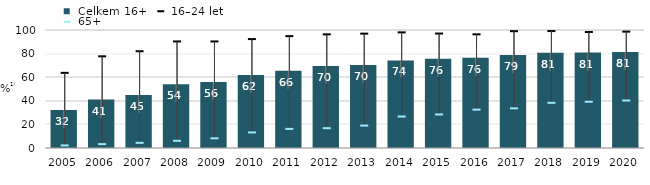
| Category |  Celkem 16+ |
|---|---|
| 2005.0 | 32.1 |
| 2006.0 | 41 |
| 2007.0 | 45 |
| 2008.0 | 54 |
| 2009.0 | 55.9 |
| 2010.0 | 61.8 |
| 2011.0 | 65.5 |
| 2012.0 | 69.5 |
| 2013.0 | 70.4 |
| 2014.0 | 74.232 |
| 2015.0 | 75.669 |
| 2016.0 | 76.481 |
| 2017.0 | 78.8 |
| 2018.0 | 80.7 |
| 2019.0 | 80.9 |
| 2020.0 | 81.339 |